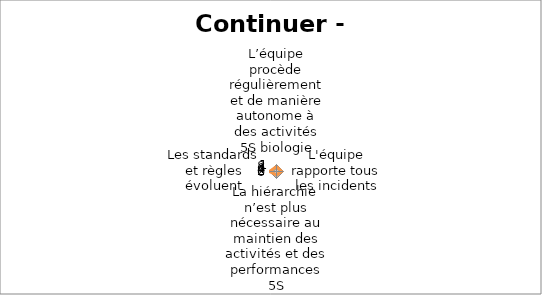
| Category | Series 2 |
|---|---|
| L’équipe procède régulièrement et de manière autonome à des activités 5S biologie | 7 |
| L'équipe rapporte tous les incidents | 7 |
| La hiérarchie n’est plus nécessaire au maintien des activités et des performances 5S | 5 |
| Les standards et règles évoluent | 10 |